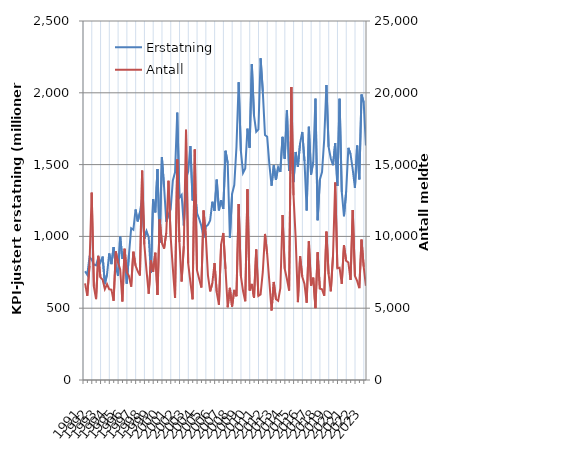
| Category | Erstatning |
|---|---|
| 1991.0 | 756.992 |
| nan | 732.306 |
| nan | 854.457 |
| nan | 839.934 |
| 1992.0 | 803.669 |
| nan | 798.537 |
| nan | 852.619 |
| nan | 818.43 |
| 1993.0 | 859.386 |
| nan | 667.417 |
| nan | 736.367 |
| nan | 881.266 |
| 1994.0 | 806.915 |
| nan | 925.663 |
| nan | 793.362 |
| nan | 724.357 |
| 1995.0 | 998.354 |
| nan | 843.839 |
| nan | 890.374 |
| nan | 671.467 |
| 1996.0 | 874.845 |
| nan | 1056.889 |
| nan | 1046.349 |
| nan | 1187.268 |
| 1997.0 | 1104.294 |
| nan | 1167.795 |
| nan | 1266.048 |
| nan | 984.273 |
| 1998.0 | 1036.917 |
| nan | 993.658 |
| nan | 744.712 |
| nan | 1259.538 |
| 1999.0 | 1167.013 |
| nan | 1469.569 |
| nan | 957.4 |
| nan | 1552.154 |
| 2000.0 | 1346.048 |
| nan | 1101.584 |
| nan | 1151.677 |
| nan | 1188.563 |
| 2001.0 | 1389.318 |
| nan | 1446.181 |
| nan | 1862.119 |
| nan | 1269.053 |
| 2002.0 | 1288.952 |
| nan | 1075.774 |
| nan | 1403.72 |
| nan | 1451.92 |
| 2003.0 | 1629.132 |
| nan | 1250.543 |
| nan | 1320.082 |
| nan | 1162.57 |
| 2004.0 | 1121.24 |
| nan | 1072.595 |
| nan | 991.897 |
| nan | 1068.606 |
| 2005.0 | 1080.186 |
| nan | 1111.288 |
| nan | 1241.457 |
| nan | 1178.087 |
| 2006.0 | 1395.001 |
| nan | 1181.532 |
| nan | 1253.015 |
| nan | 1191.968 |
| 2007.0 | 1596.231 |
| nan | 1512.131 |
| nan | 990.694 |
| nan | 1296.034 |
| 2008.0 | 1357.452 |
| nan | 1624.06 |
| nan | 2073.663 |
| nan | 1597.434 |
| 2009.0 | 1442.346 |
| nan | 1472.565 |
| nan | 1750.244 |
| nan | 1617.137 |
| 2010.0 | 2199.59 |
| nan | 1840.739 |
| nan | 1728.26 |
| nan | 1744.931 |
| 2011.0 | 2240.46 |
| nan | 2010.09 |
| nan | 1705.829 |
| nan | 1693.375 |
| 2012.0 | 1499.899 |
| nan | 1353.188 |
| nan | 1495.402 |
| nan | 1393.323 |
| 2013.0 | 1482.488 |
| nan | 1449.626 |
| nan | 1693.427 |
| nan | 1539.125 |
| 2014.0 | 1877.73 |
| nan | 1455.658 |
| nan | 1579.203 |
| nan | 1378.34 |
| 2015.0 | 1587.997 |
| nan | 1484.431 |
| nan | 1648.534 |
| nan | 1727.346 |
| 2016.0 | 1524.912 |
| nan | 1179.956 |
| nan | 1763.87 |
| nan | 1430.584 |
| 2017.0 | 1520.705 |
| nan | 1959.355 |
| nan | 1112.185 |
| nan | 1394.391 |
| 2018.0 | 1447.668 |
| nan | 1676.208 |
| nan | 2054.885 |
| nan | 1623.42 |
| 2019.0 | 1542.846 |
| nan | 1495.913 |
| nan | 1648.395 |
| nan | 1350.624 |
| 2020.0 | 1958.172 |
| nan | 1311.62 |
| nan | 1140.353 |
| nan | 1311.536 |
| 2021.0 | 1616.757 |
| nan | 1573.102 |
| nan | 1465.287 |
| nan | 1338.133 |
| 2022.0 | 1632.579 |
| nan | 1397.111 |
| nan | 1987.932 |
| nan | 1932.525 |
| 2023.0 | 1632.912 |